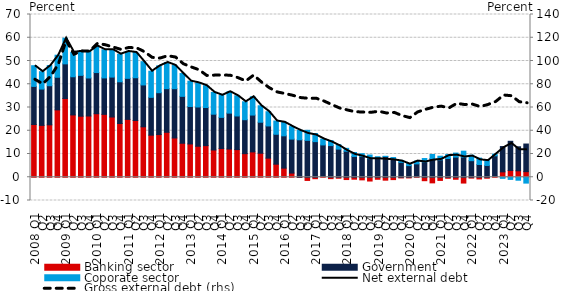
| Category | Banking sector | Government | Coporate sector |
|---|---|---|---|
|   2008 Q1 | 22.687 | 16.383 | 8.905 |
| Q2 | 22.302 | 15.632 | 7.464 |
| Q3 | 22.546 | 16.826 | 8.669 |
| Q4 | 28.975 | 14.03 | 9.491 |
|   2009 Q1 | 33.864 | 14.909 | 11.025 |
| Q2 | 26.811 | 16.412 | 10.515 |
| Q3 | 26.251 | 17.578 | 10.348 |
| Q4 | 26.341 | 16.359 | 11.274 |
|  2010 Q1 | 27.323 | 17.709 | 11.434 |
| Q2 | 27.05 | 15.677 | 12.099 |
| Q3 | 25.913 | 17.174 | 11.79 |
| Q4 | 23.117 | 17.938 | 11.88 |
|  2011 Q1 | 24.887 | 17.66 | 11.548 |
| Q2 | 24.412 | 18.395 | 10.845 |
| Q3 | 21.689 | 18.018 | 10.013 |
| Q4 | 18.104 | 16.258 | 11.245 |
|  2012 Q1 | 18.362 | 18.001 | 11.53 |
| Q2 | 19.341 | 18.758 | 11.252 |
| Q3 | 16.894 | 21.196 | 10.013 |
| Q4 | 14.629 | 20.171 | 9.826 |
|  2013 Q1 | 14.328 | 16.11 | 10.887 |
| Q2 | 13.34 | 16.882 | 10.367 |
| Q3 | 13.602 | 16.389 | 9.401 |
| Q4 | 11.723 | 15.4 | 9.37 |
|  2014 Q1 | 12.351 | 13.401 | 9.502 |
| Q2 | 12.137 | 15.448 | 9.187 |
| Q3 | 11.891 | 14.465 | 8.697 |
| Q4 | 10.149 | 14.601 | 7.703 |
|  2015 Q1 | 10.906 | 15.845 | 7.86 |
| Q2 | 10.329 | 13.34 | 7.084 |
| Q3 | 8.225 | 13.85 | 6.106 |
| Q4 | 5.629 | 12.857 | 5.704 |
|  2016 Q1 | 3.932 | 13.888 | 5.793 |
| Q2 | 1.8 | 14.612 | 5.376 |
| Q3 | -0.068 | 16.116 | 4.089 |
| Q4 | -1.368 | 15.868 | 4.316 |
|  2017 Q1 | -0.624 | 15.314 | 3.491 |
| Q2 | 0.346 | 13.558 | 2.536 |
| Q3 | -0.599 | 13.622 | 2.153 |
| Q4 | -0.426 | 12.115 | 1.875 |
|  2018 Q1 | -0.991 | 11.193 | 1.242 |
| Q2 | -0.842 | 8.939 | 1.709 |
| Q3 | -1.124 | 8.903 | 1.228 |
| Q4 | -1.622 | 8.007 | 1.552 |
|  2019 Q1 | -0.872 | 8.235 | 0.586 |
| Q2 | -1.257 | 8.897 | 0.112 |
| Q3 | -1.015 | 8.142 | 0.328 |
| Q4 | -0.294 | 6.405 | 0.825 |
|  2020 Q1 | -0.29 | 5.01 | 0.899 |
| Q2 | 0.22 | 5.55 | 1.187 |
| Q3 | -1.482 | 6.606 | 1.445 |
| Q4 | -2.413 | 8.006 | 1.777 |
| 2021 Q1 | -1.362 | 7.504 | 1.545 |
| Q2 | -0.444 | 8.064 | 1.694 |
| Q3 | -0.87 | 8.674 | 1.719 |
| Q4 | -2.496 | 8.679 | 2.532 |
| 2022 Q1 | -0.373 | 7.13 | 2.359 |
| Q2 | -0.738 | 5.483 | 2.747 |
| Q3 | -0.416 | 5.07 | 2.49 |
| Q4 | 0.328 | 8.906 | 0.702 |
| 2023 Q1 | 2.318 | 10.881 | -0.476 |
| Q2 | 2.918 | 12.547 | -0.929 |
| Q3 | 2.772 | 10.331 | -1.279 |
| Q4 | 2.415 | 11.874 | -2.521 |